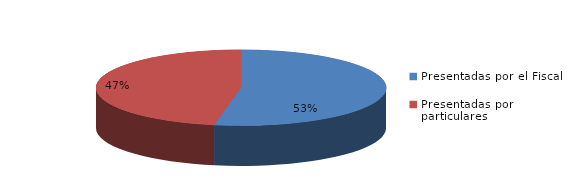
| Category | Series 0 |
|---|---|
| Presentadas por el Fiscal | 45 |
| Presentadas por particulares | 40 |